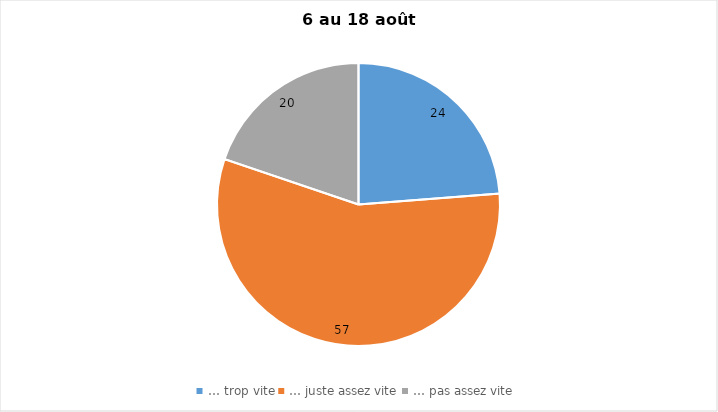
| Category | Series 0 |
|---|---|
| … trop vite | 24 |
| … juste assez vite | 57 |
| … pas assez vite | 20 |